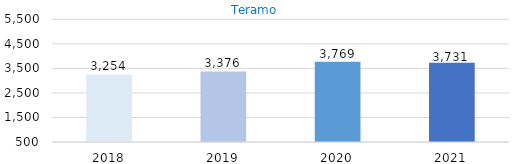
| Category | Teramo |
|---|---|
| 2018.0 | 3254 |
| 2019.0 | 3376 |
| 2020.0 | 3769 |
| 2021.0 | 3731 |